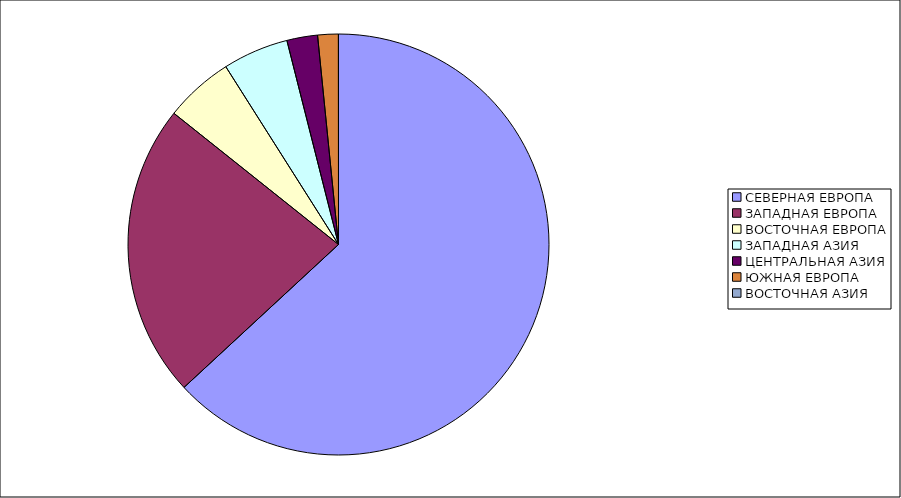
| Category | Оборот |
|---|---|
| СЕВЕРНАЯ ЕВРОПА | 63.117 |
| ЗАПАДНАЯ ЕВРОПА | 22.594 |
| ВОСТОЧНАЯ ЕВРОПА | 5.297 |
| ЗАПАДНАЯ АЗИЯ | 5.048 |
| ЦЕНТРАЛЬНАЯ АЗИЯ | 2.354 |
| ЮЖНАЯ ЕВРОПА | 1.583 |
| ВОСТОЧНАЯ АЗИЯ | 0.006 |